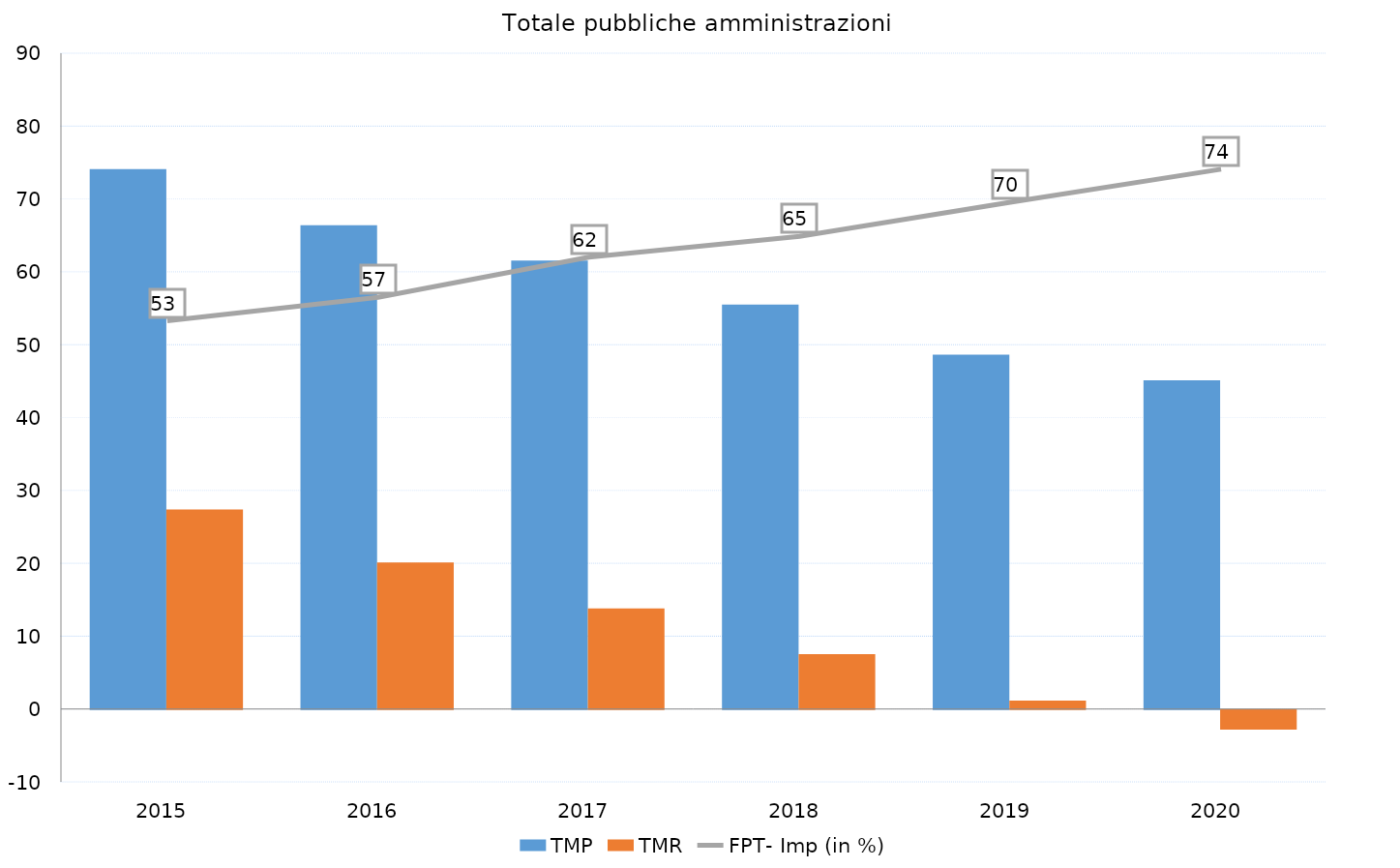
| Category | TMP | TMR |
|---|---|---|
| 2015.0 | 74.099 | 27.391 |
| 2016.0 | 66.393 | 20.107 |
| 2017.0 | 61.536 | 13.814 |
| 2018.0 | 55.494 | 7.539 |
| 2019.0 | 48.62 | 1.163 |
| 2020.0 | 45.098 | -2.702 |